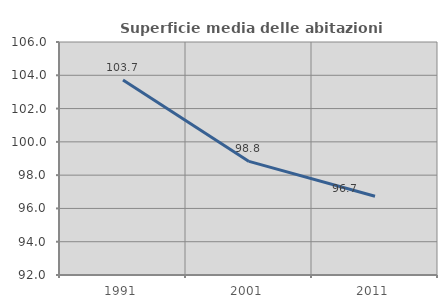
| Category | Superficie media delle abitazioni occupate |
|---|---|
| 1991.0 | 103.716 |
| 2001.0 | 98.825 |
| 2011.0 | 96.728 |